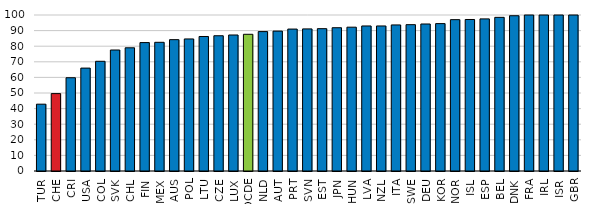
| Category | Enrolment rate (%) |
|---|---|
| TUR | 42.831 |
| CHE | 49.61 |
| CRI | 59.792 |
| USA | 65.963 |
| COL | 70.33 |
| SVK | 77.556 |
| CHL | 78.967 |
| FIN | 82.312 |
| MEX | 82.493 |
| AUS | 84.196 |
| POL | 84.65 |
| LTU | 86.224 |
| CZE | 86.708 |
| LUX | 87.184 |
| OCDE | 87.633 |
| NLD | 89.361 |
| AUT | 89.675 |
| PRT | 90.977 |
| SVN | 91.087 |
| EST | 91.237 |
| JPN | 91.84 |
| HUN | 92.195 |
| LVA | 92.973 |
| NZL | 92.978 |
| ITA | 93.631 |
| SWE | 93.801 |
| DEU | 94.233 |
| KOR | 94.476 |
| NOR | 97.019 |
| ISL | 97.121 |
| ESP | 97.51 |
| BEL | 98.492 |
| DNK | 99.532 |
| FRA | 100 |
| IRL | 100 |
| ISR | 100 |
| GBR | 100 |